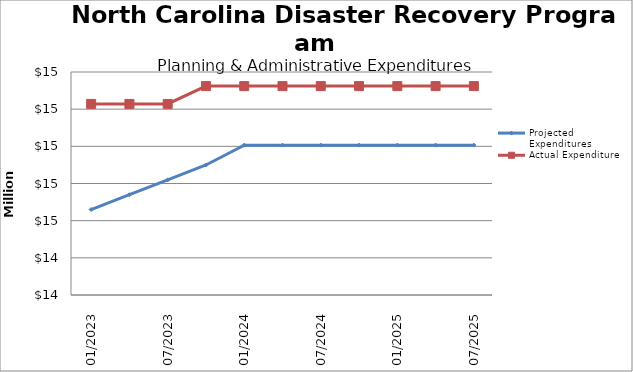
| Category | Projected Expenditures | Actual Expenditure |
|---|---|---|
| 01/2023 | 14659672.2 | 15228219 |
| 4/2023 | 14739672.2 | 15228219 |
| 07/2023 | 14819672.2 | 15228218.87 |
| 10/2023 | 14899672.2 | 15324127.62 |
| 01/2024 | 15006450.2 | 15324127.62 |
| 4/2024 | 15006450.2 | 15324127.62 |
| 07/2024 | 15006450.2 | 15324127.62 |
| 10/2024 | 15006450.2 | 15324127.62 |
| 01/2025 | 15006450.2 | 15324127.62 |
| 4/2025 | 15006450.2 | 15324127.62 |
| 07/2025 | 15006450.2 | 15324127.62 |